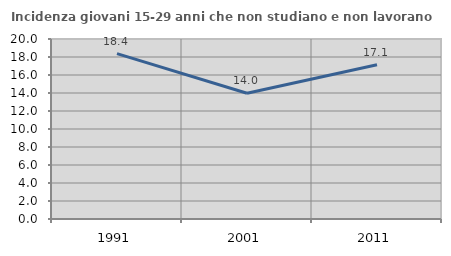
| Category | Incidenza giovani 15-29 anni che non studiano e non lavorano  |
|---|---|
| 1991.0 | 18.378 |
| 2001.0 | 13.972 |
| 2011.0 | 17.136 |